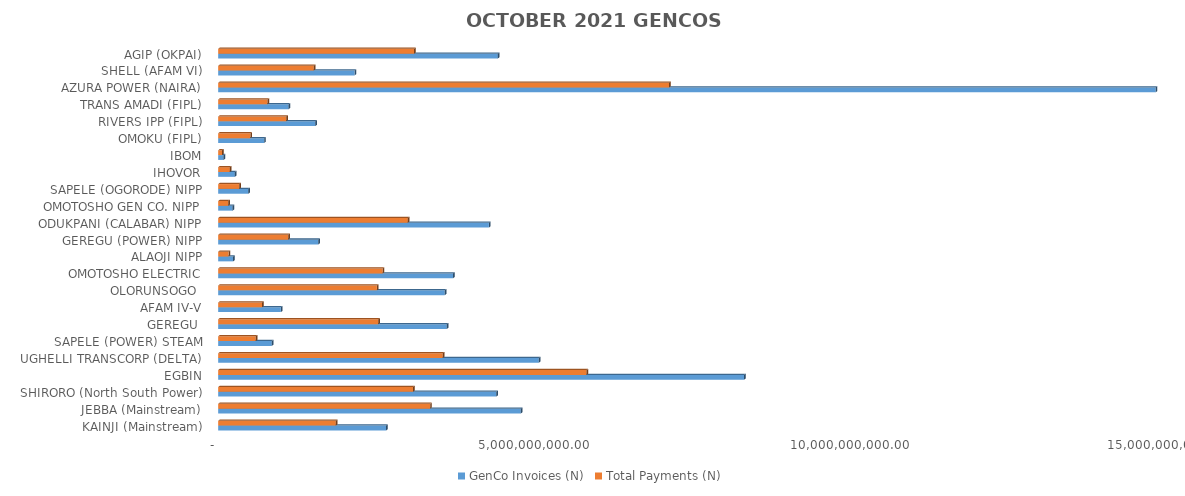
| Category | GenCo Invoices (N) | Total Payments (N) |
|---|---|---|
| KAINJI (Mainstream) | 2655564517.66 | 1860384572.722 |
| JEBBA (Mainstream) | 4785995237.87 | 3352880958.621 |
| SHIRORO (North South Power) | 4398026399 | 3081085173.683 |
| EGBIN | 8317379175.98 | 5826830341.182 |
| UGHELLI TRANSCORP (DELTA) | 5070149655.61 | 3551948423.003 |
| SAPELE (POWER) STEAM | 847787379.02 | 593926658.678 |
| GEREGU  | 3615929865.27 | 2533178950.334 |
| AFAM IV-V | 991857758.58 | 694856728.249 |
| OLORUNSOGO  | 3583373506.41 | 2510371239.445 |
| OMOTOSHO ELECTRIC | 3714446039.85 | 2602195526.71 |
| ALAOJI NIPP | 235965176.86 | 165307968.159 |
| GEREGU (POWER) NIPP | 1583503725.68 | 1109340738.103 |
| ODUKPANI (CALABAR) NIPP | 4282036662.45 | 2999827303.638 |
| OMOTOSHO GEN CO. NIPP | 228404949.92 | 160011569.043 |
| SAPELE (OGORODE) NIPP | 477499775.32 | 334517655.126 |
| IHOVOR | 264013091.57 | 184957239.52 |
| IBOM | 86080183.79 | 60304407.923 |
| OMOKU (FIPL) | 727359523.4 | 509559616.103 |
| RIVERS IPP (FIPL) | 1536369083.14 | 1076320052.204 |
| TRANS AMADI (FIPL) | 1113985096.14 | 780414361.36 |
| AZURA POWER (NAIRA) | 14828282649.908 | 7131954457.923 |
| SHELL (AFAM VI) | 2158299521.899 | 1512020177.688 |
| AGIP (OKPAI) | 4423851342.445 | 3099177118.374 |